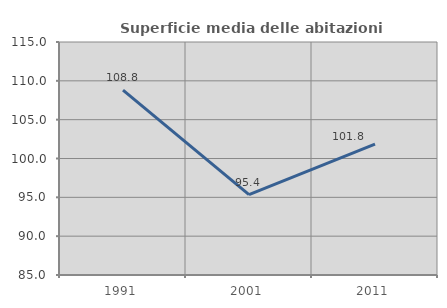
| Category | Superficie media delle abitazioni occupate |
|---|---|
| 1991.0 | 108.813 |
| 2001.0 | 95.36 |
| 2011.0 | 101.842 |